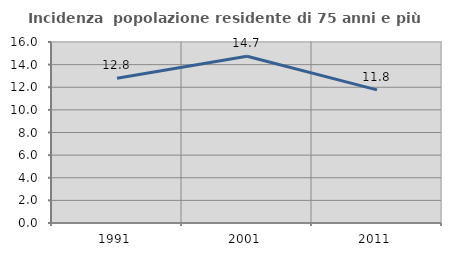
| Category | Incidenza  popolazione residente di 75 anni e più |
|---|---|
| 1991.0 | 12.8 |
| 2001.0 | 14.737 |
| 2011.0 | 11.765 |